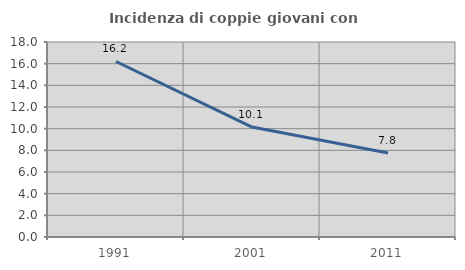
| Category | Incidenza di coppie giovani con figli |
|---|---|
| 1991.0 | 16.2 |
| 2001.0 | 10.148 |
| 2011.0 | 7.757 |